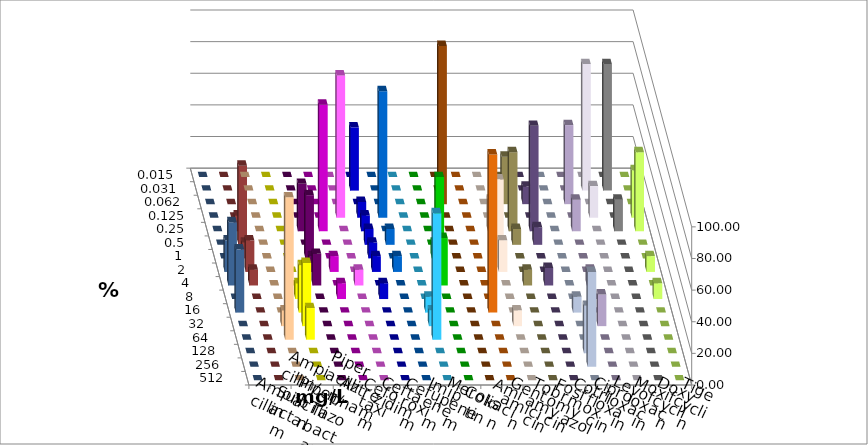
| Category | Ampicillin | Ampicillin/ Sulbactam | Piperacillin | Piperacillin/ Tazobactam | Aztreonam | Cefotaxim | Ceftazidim | Cefuroxim | Imipenem | Meropenem | Colistin | Amikacin | Gentamicin | Tobramycin | Fosfomycin | Cotrimoxazol | Ciprofloxacin | Levofloxacin | Moxifloxacin | Doxycyclin | Tigecyclin |
|---|---|---|---|---|---|---|---|---|---|---|---|---|---|---|---|---|---|---|---|---|---|
| 0.015 | 0 | 0 | 0 | 0 | 0 | 0 | 0 | 0 | 0 | 0 | 0 | 0 | 0 | 0 | 0 | 0 | 0 | 0 | 0 | 0 | 0 |
| 0.031 | 0 | 0 | 0 | 0 | 0 | 40 | 0 | 0 | 0 | 0 | 0 | 0 | 0 | 0 | 0 | 0 | 80 | 80 | 0 | 0 | 0 |
| 0.062 | 0 | 0 | 0 | 0 | 0 | 0 | 0 | 0 | 0 | 100 | 0 | 0 | 30 | 11.111 | 0 | 50 | 0 | 0 | 0 | 0 | 0 |
| 0.125 | 0 | 0 | 0 | 0 | 90 | 10 | 80 | 0 | 0 | 0 | 0 | 0 | 0 | 0 | 0 | 0 | 20 | 0 | 30 | 0 | 0 |
| 0.25 | 0 | 0 | 30 | 80 | 0 | 10 | 0 | 0 | 0 | 0 | 0 | 20 | 50 | 66.667 | 0 | 20 | 0 | 20 | 50 | 0 | 10 |
| 0.5 | 0 | 0 | 0 | 0 | 0 | 10 | 10 | 0 | 0 | 0 | 0 | 0 | 10 | 11.111 | 0 | 0 | 0 | 0 | 0 | 0 | 50 |
| 1.0 | 0 | 0 | 40 | 0 | 0 | 10 | 0 | 0 | 10 | 0 | 0 | 50 | 0 | 0 | 0 | 0 | 0 | 0 | 0 | 0 | 10 |
| 2.0 | 0 | 0 | 10 | 10 | 0 | 10 | 10 | 0 | 60 | 0 | 0 | 20 | 0 | 0 | 0 | 0 | 0 | 0 | 10 | 20 | 20 |
| 4.0 | 0 | 0 | 20 | 0 | 10 | 0 | 0 | 0 | 30 | 0 | 0 | 0 | 10 | 11.111 | 0 | 10 | 0 | 0 | 0 | 40 | 10 |
| 8.0 | 0 | 10 | 0 | 10 | 0 | 10 | 0 | 0 | 0 | 0 | 0 | 0 | 0 | 0 | 0 | 0 | 0 | 0 | 10 | 0 | 0 |
| 16.0 | 0 | 30 | 0 | 0 | 0 | 0 | 0 | 10 | 0 | 0 | 100 | 0 | 0 | 0 | 10 | 0 | 0 | 0 | 0 | 40 | 0 |
| 32.0 | 10 | 40 | 0 | 0 | 0 | 0 | 0 | 10 | 0 | 0 | 0 | 10 | 0 | 0 | 0 | 20 | 0 | 0 | 0 | 0 | 0 |
| 64.0 | 90 | 20 | 0 | 0 | 0 | 0 | 0 | 80 | 0 | 0 | 0 | 0 | 0 | 0 | 0 | 0 | 0 | 0 | 0 | 0 | 0 |
| 128.0 | 0 | 0 | 0 | 0 | 0 | 0 | 0 | 0 | 0 | 0 | 0 | 0 | 0 | 0 | 30 | 0 | 0 | 0 | 0 | 0 | 0 |
| 256.0 | 0 | 0 | 0 | 0 | 0 | 0 | 0 | 0 | 0 | 0 | 0 | 0 | 0 | 0 | 60 | 0 | 0 | 0 | 0 | 0 | 0 |
| 512.0 | 0 | 0 | 0 | 0 | 0 | 0 | 0 | 0 | 0 | 0 | 0 | 0 | 0 | 0 | 0 | 0 | 0 | 0 | 0 | 0 | 0 |